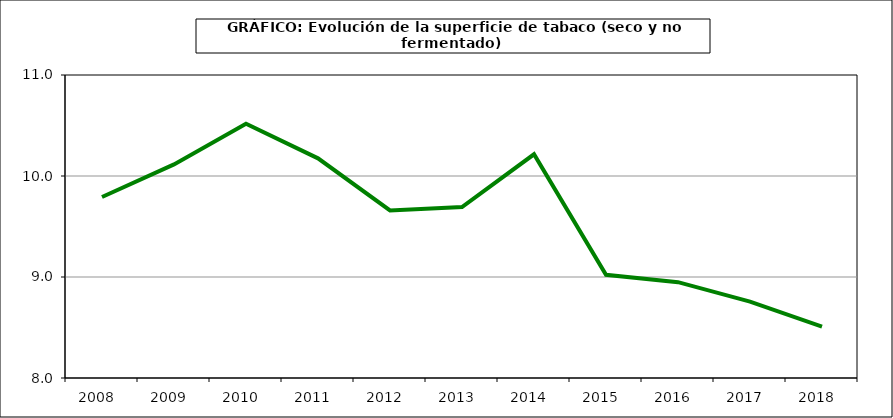
| Category | Superficie |
|---|---|
| 2008.0 | 9.792 |
| 2009.0 | 10.115 |
| 2010.0 | 10.517 |
| 2011.0 | 10.175 |
| 2012.0 | 9.659 |
| 2013.0 | 9.693 |
| 2014.0 | 10.215 |
| 2015.0 | 9.022 |
| 2016.0 | 8.949 |
| 2017.0 | 8.756 |
| 2018.0 | 8.509 |